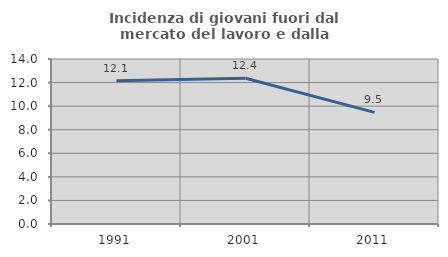
| Category | Incidenza di giovani fuori dal mercato del lavoro e dalla formazione  |
|---|---|
| 1991.0 | 12.15 |
| 2001.0 | 12.371 |
| 2011.0 | 9.474 |